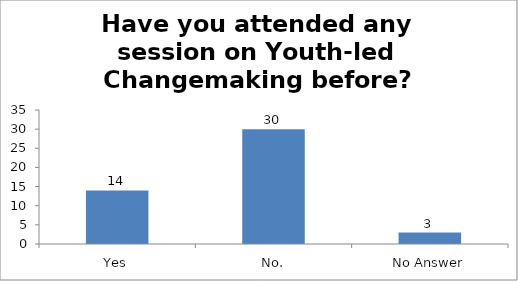
| Category | Have you attended any session on Youth-led Changemaking before? |
|---|---|
| Yes | 14 |
| No. | 30 |
| No Answer | 3 |